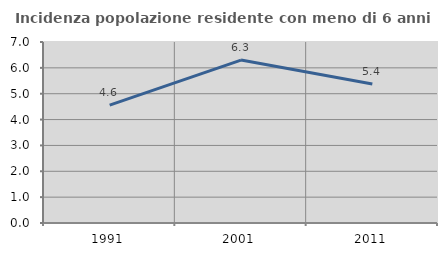
| Category | Incidenza popolazione residente con meno di 6 anni |
|---|---|
| 1991.0 | 4.559 |
| 2001.0 | 6.3 |
| 2011.0 | 5.379 |